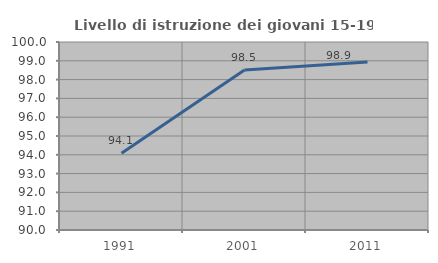
| Category | Livello di istruzione dei giovani 15-19 anni |
|---|---|
| 1991.0 | 94.082 |
| 2001.0 | 98.512 |
| 2011.0 | 98.934 |